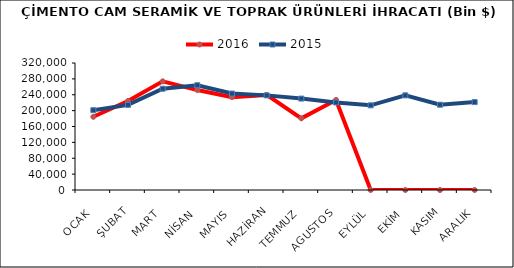
| Category | 2016 | 2015 |
|---|---|---|
| OCAK | 184487.563 | 201065.28 |
| ŞUBAT | 224270.809 | 214500.385 |
| MART | 273820.636 | 255234.014 |
| NİSAN | 251763.055 | 264035.475 |
| MAYIS | 234042.245 | 243012.056 |
| HAZİRAN | 239630.976 | 238435.643 |
| TEMMUZ | 180628.492 | 230345.854 |
| AGUSTOS | 226850.149 | 220589.034 |
| EYLÜL | 0 | 213315.561 |
| EKİM | 0 | 238482.42 |
| KASIM | 0 | 214862.836 |
| ARALIK | 0 | 221473.412 |